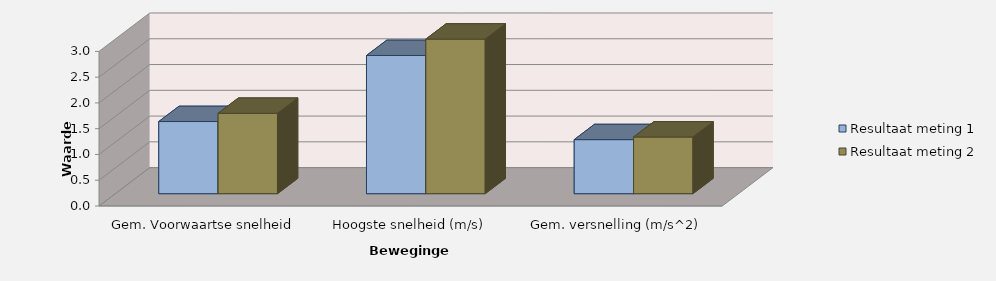
| Category | Resultaat meting 1 | Resultaat meting 2 |
|---|---|---|
| Gem. Voorwaartse snelheid (m/s) | 1.4 | 1.56 |
| Hoogste snelheid (m/s) | 2.682 | 3 |
| Gem. versnelling (m/s^2) | 1.049 | 1.1 |